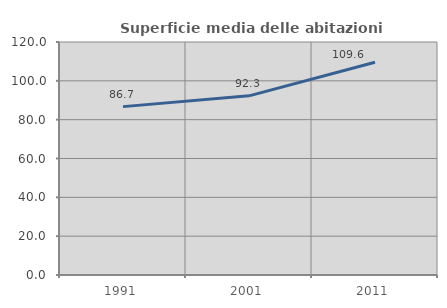
| Category | Superficie media delle abitazioni occupate |
|---|---|
| 1991.0 | 86.716 |
| 2001.0 | 92.274 |
| 2011.0 | 109.594 |